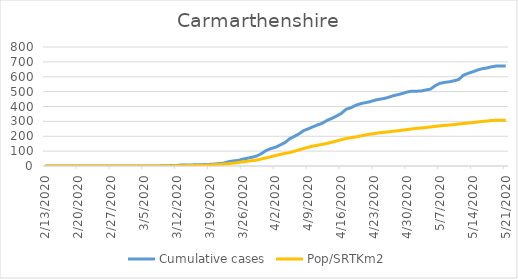
| Category | Cumulative cases | Pop/SRTKm2 |
|---|---|---|
| 5/21/20 | 672 | 307.485 |
| 5/20/20 | 672 | 307.485 |
| 5/19/20 | 672 | 307.413 |
| 5/18/20 | 667 | 305.727 |
| 5/17/20 | 659 | 302.14 |
| 5/16/20 | 654 | 299.467 |
| 5/15/20 | 645 | 295.711 |
| 5/14/20 | 633 | 291.546 |
| 5/13/20 | 623 | 288.657 |
| 5/12/20 | 610 | 285.334 |
| 5/11/20 | 581 | 282.036 |
| 5/10/20 | 573 | 277.943 |
| 5/9/20 | 566 | 275.559 |
| 5/8/20 | 562 | 272.574 |
| 5/7/20 | 556 | 270.166 |
| 5/6/20 | 540 | 266.193 |
| 5/5/20 | 517 | 262.221 |
| 5/4/20 | 511 | 258.392 |
| 5/3/20 | 504 | 255.31 |
| 5/2/20 | 503 | 253.047 |
| 5/1/20 | 503 | 249.026 |
| 4/30/20 | 497 | 245.222 |
| 4/29/20 | 487 | 240.6 |
| 4/28/20 | 479 | 236.675 |
| 4/27/20 | 472 | 233.16 |
| 4/26/20 | 461 | 229.211 |
| 4/25/20 | 453 | 226.346 |
| 4/24/20 | 448 | 223.096 |
| 4/23/20 | 441 | 218.112 |
| 4/22/20 | 431 | 213.345 |
| 4/21/20 | 425 | 207.301 |
| 4/20/20 | 418 | 201.21 |
| 4/19/20 | 407 | 194.589 |
| 4/18/20 | 391 | 190.303 |
| 4/17/20 | 381 | 184.452 |
| 4/16/20 | 353 | 176.7 |
| 4/15/20 | 336 | 168.056 |
| 4/14/20 | 320 | 159.509 |
| 4/13/20 | 307 | 152.045 |
| 4/12/20 | 288 | 145.617 |
| 4/11/20 | 277 | 139.766 |
| 4/10/20 | 264 | 133.891 |
| 4/9/20 | 250 | 126.668 |
| 4/8/20 | 238 | 117.278 |
| 4/7/20 | 216 | 108.057 |
| 4/6/20 | 199 | 99.004 |
| 4/5/20 | 183 | 89.879 |
| 4/4/20 | 157 | 84.558 |
| 4/3/20 | 141 | 77.792 |
| 4/2/20 | 126 | 69.991 |
| 4/1/20 | 117 | 61.974 |
| 3/31/20 | 104 | 54.269 |
| 3/30/20 | 83 | 47.744 |
| 3/29/20 | 67 | 39.703 |
| 3/28/20 | 59 | 35.947 |
| 3/27/20 | 52 | 31.95 |
| 3/26/20 | 46 | 27.496 |
| 3/25/20 | 37 | 23.306 |
| 3/24/20 | 34 | 18.9 |
| 3/23/20 | 29 | 15.65 |
| 3/22/20 | 19 | 12.52 |
| 3/21/20 | 16 | 10.69 |
| 3/20/20 | 13 | 8.884 |
| 3/19/20 | 11 | 7.151 |
| 3/18/20 | 10 | 5.706 |
| 3/17/20 | 8 | 4.864 |
| 3/16/20 | 8 | 3.973 |
| 3/15/20 | 7 | 3.154 |
| 3/14/20 | 7 | 2.456 |
| 3/13/20 | 7 | 1.998 |
| 3/12/20 | 4 | 1.348 |
| 3/11/20 | 3 | 0.77 |
| 3/10/20 | 2 | 0.433 |
| 3/9/20 | 2 | 0.169 |
| 3/8/20 | 0 | 0.096 |
| 3/7/20 | 0 | 0.096 |
| 3/6/20 | 0 | 0.048 |
| 3/5/20 | 0 | 0.048 |
| 3/4/20 | 0 | 0.048 |
| 3/3/20 | 0 | 0.024 |
| 3/2/20 | 0 | 0.024 |
| 3/1/20 | 0 | 0.024 |
| 2/29/20 | 0 | 0.024 |
| 2/28/20 | 0 | 0.024 |
| 2/27/20 | 0 | 0.024 |
| 2/26/20 | 0 | 0 |
| 2/25/20 | 0 | 0 |
| 2/24/20 | 0 | 0 |
| 2/23/20 | 0 | 0 |
| 2/22/20 | 0 | 0 |
| 2/21/20 | 0 | 0 |
| 2/20/20 | 0 | 0 |
| 2/19/20 | 0 | 0 |
| 2/18/20 | 0 | 0 |
| 2/17/20 | 0 | 0 |
| 2/16/20 | 0 | 0 |
| 2/15/20 | 0 | 0 |
| 2/14/20 | 0 | 0 |
| 2/13/20 | 0 | 0 |